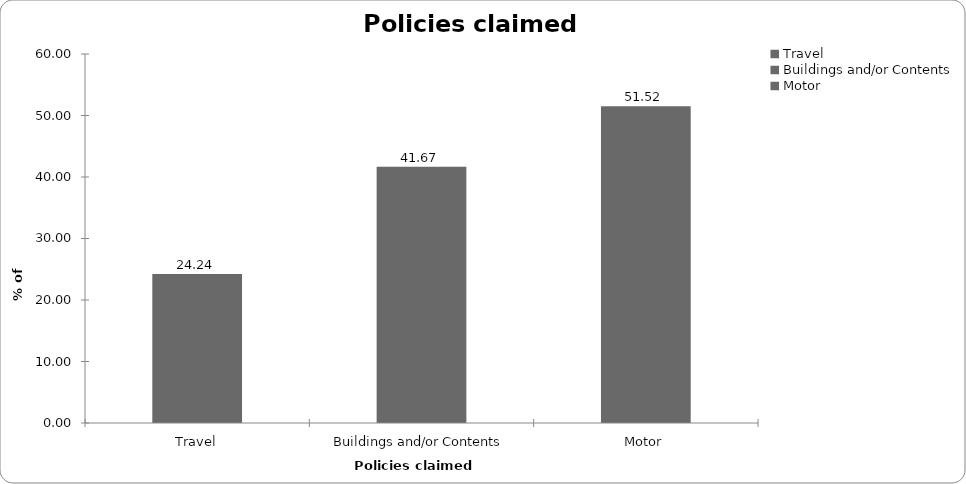
| Category | Policies claimed on |
|---|---|
| Travel | 24.242 |
| Buildings and/or Contents | 41.667 |
| Motor | 51.515 |